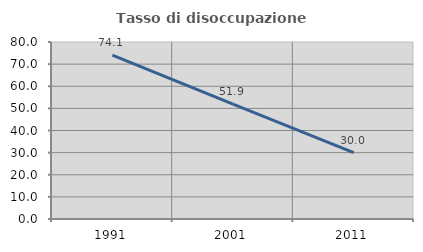
| Category | Tasso di disoccupazione giovanile  |
|---|---|
| 1991.0 | 74.057 |
| 2001.0 | 51.948 |
| 2011.0 | 30 |